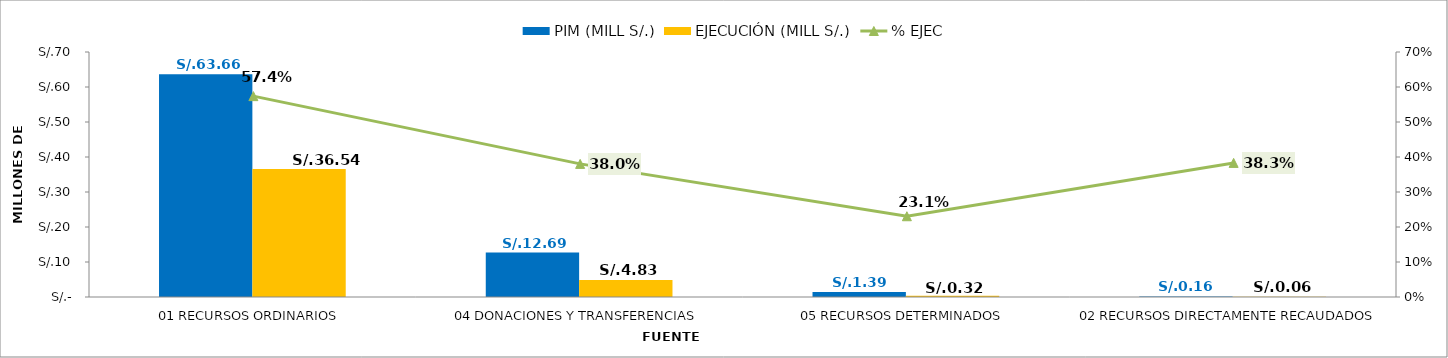
| Category | PIM (MILL S/.) | EJECUCIÓN (MILL S/.) |
|---|---|---|
| 01 RECURSOS ORDINARIOS | 63.664 | 36.536 |
| 04 DONACIONES Y TRANSFERENCIAS | 12.692 | 4.827 |
| 05 RECURSOS DETERMINADOS | 1.394 | 0.322 |
| 02 RECURSOS DIRECTAMENTE RECAUDADOS | 0.157 | 0.06 |